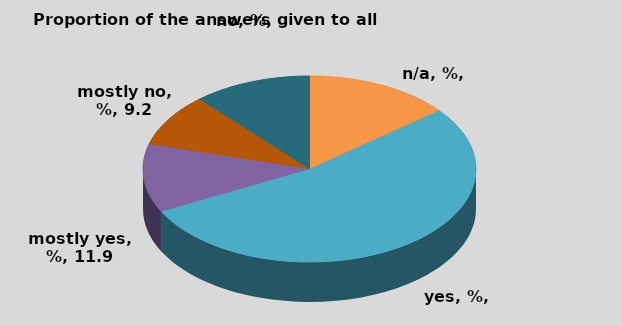
| Category | B |
|---|---|
| n/a, % | 14.176 |
| yes, % | 53.257 |
| mostly yes, % | 11.877 |
| mostly no, % | 9.195 |
| no, % | 11.494 |